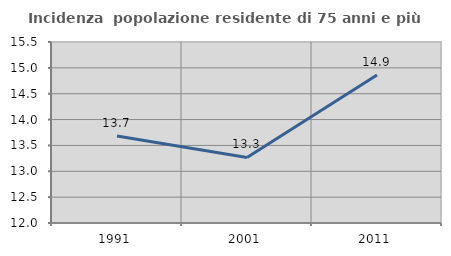
| Category | Incidenza  popolazione residente di 75 anni e più |
|---|---|
| 1991.0 | 13.683 |
| 2001.0 | 13.267 |
| 2011.0 | 14.862 |